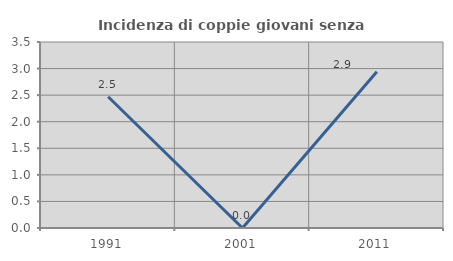
| Category | Incidenza di coppie giovani senza figli |
|---|---|
| 1991.0 | 2.469 |
| 2001.0 | 0 |
| 2011.0 | 2.941 |